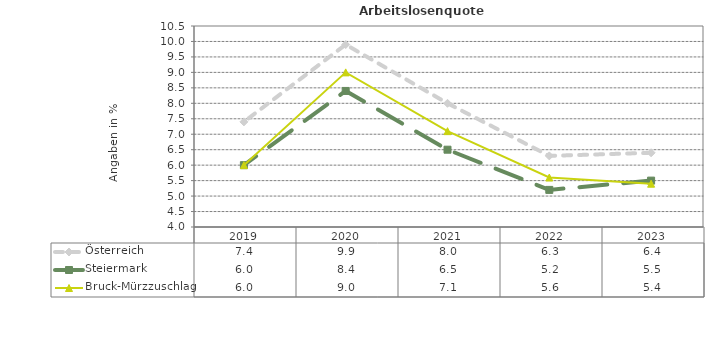
| Category | Österreich | Steiermark | Bruck-Mürzzuschlag |
|---|---|---|---|
| 2023.0 | 6.4 | 5.5 | 5.4 |
| 2022.0 | 6.3 | 5.2 | 5.6 |
| 2021.0 | 8 | 6.5 | 7.1 |
| 2020.0 | 9.9 | 8.4 | 9 |
| 2019.0 | 7.4 | 6 | 6 |